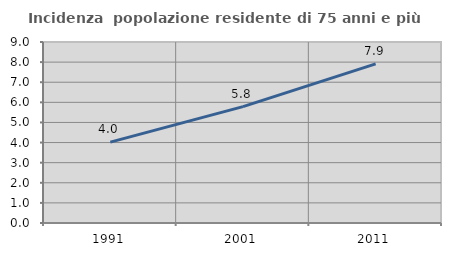
| Category | Incidenza  popolazione residente di 75 anni e più |
|---|---|
| 1991.0 | 4.024 |
| 2001.0 | 5.789 |
| 2011.0 | 7.911 |